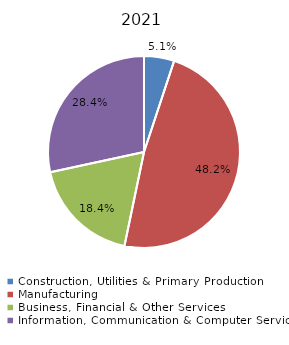
| Category | Series 0 |
|---|---|
| Construction, Utilities & Primary Production  | 0.051 |
| Manufacturing  | 0.482 |
| Business, Financial & Other Services | 0.184 |
| Information, Communication & Computer Services | 0.284 |